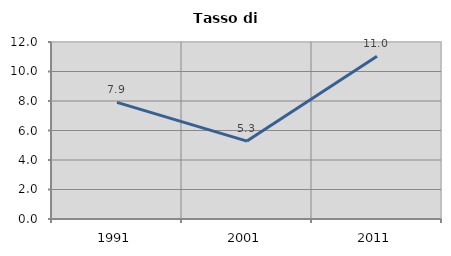
| Category | Tasso di disoccupazione   |
|---|---|
| 1991.0 | 7.904 |
| 2001.0 | 5.283 |
| 2011.0 | 11.029 |